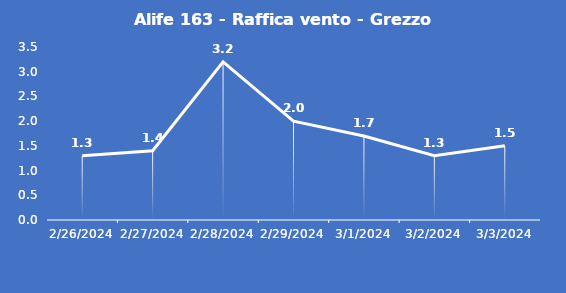
| Category | Alife 163 - Raffica vento - Grezzo (m/s) |
|---|---|
| 2/26/24 | 1.3 |
| 2/27/24 | 1.4 |
| 2/28/24 | 3.2 |
| 2/29/24 | 2 |
| 3/1/24 | 1.7 |
| 3/2/24 | 1.3 |
| 3/3/24 | 1.5 |